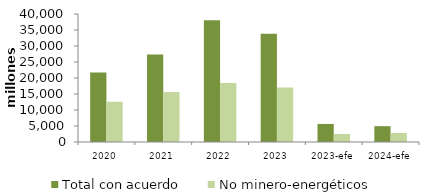
| Category | Total con acuerdo | No minero-energéticos |
|---|---|---|
| 2020 | 21713.77 | 12575.035 |
| 2021 | 27306.482 | 15630.262 |
| 2022 | 38054.525 | 18454.997 |
| 2023 | 33794.72 | 17045.828 |
| 2023-efe | 5642.647 | 2515.786 |
| 2024-efe | 4944.328 | 2817.792 |